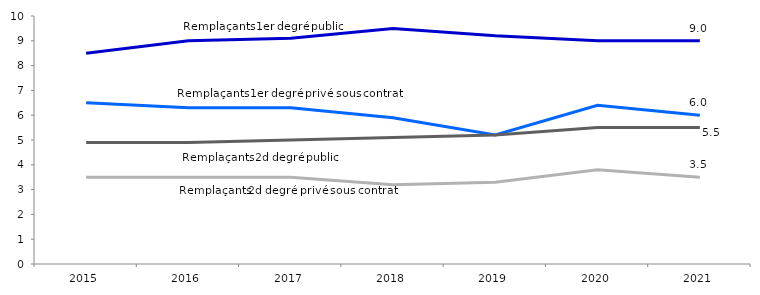
| Category | Remplaçants 1er degré Privé sous contrat | Remplaçants 1er degré Public | Remplaçants 2d degré Privé sous contrat | Remplaçants 2d degré Public |
|---|---|---|---|---|
| 2015.0 | 6.5 | 8.5 | 3.5 | 4.9 |
| 2016.0 | 6.3 | 9 | 3.5 | 4.9 |
| 2017.0 | 6.3 | 9.1 | 3.5 | 5 |
| 2018.0 | 5.9 | 9.5 | 3.2 | 5.1 |
| 2019.0 | 5.2 | 9.2 | 3.3 | 5.2 |
| 2020.0 | 6.4 | 9 | 3.8 | 5.5 |
| 2021.0 | 6 | 9 | 3.5 | 5.5 |